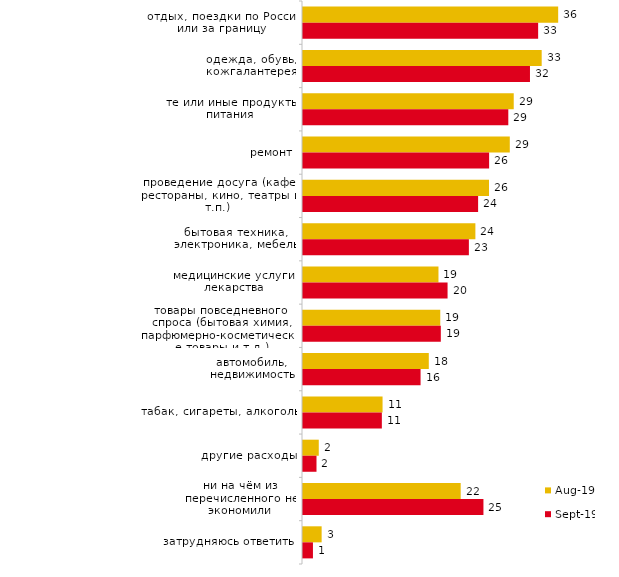
| Category | авг.19 | сен.19 |
|---|---|---|
| отдых, поездки по России или за границу | 35.564 | 32.772 |
| одежда, обувь, кожгалантерея | 33.267 | 31.634 |
| те или иные продукты питания | 29.371 | 28.614 |
| ремонт | 28.821 | 25.941 |
| проведение досуга (кафе, рестораны, кино, театры и т.п.) | 25.924 | 24.406 |
| бытовая техника, электроника, мебель | 24.026 | 23.119 |
| медицинские услуги, лекарства | 18.881 | 20.149 |
| товары повседневного спроса (бытовая химия, парфюмерно-косметические товары и т.д.) | 19.131 | 19.208 |
| автомобиль, недвижимость | 17.532 | 16.386 |
| табак, сигареты, алкоголь | 11.089 | 10.99 |
| другие расходы | 2.198 | 1.881 |
| ни на чём из перечисленного не экономили | 21.978 | 25.149 |
| затрудняюсь ответить | 2.597 | 1.386 |